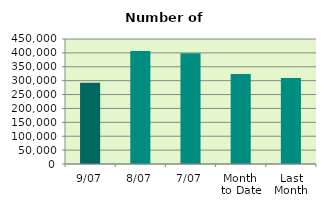
| Category | Series 0 |
|---|---|
| 9/07 | 292110 |
| 8/07 | 406932 |
| 7/07 | 398846 |
| Month 
to Date | 324261.429 |
| Last
Month | 309731.364 |